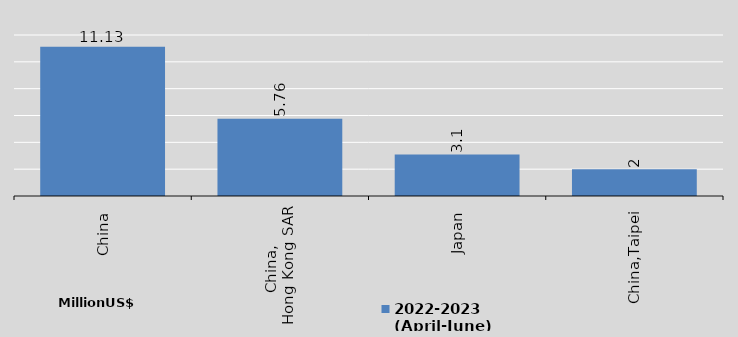
| Category | 2022-2023
(April-June) |
|---|---|
| China | 11.13 |
| China, 
Hong Kong SAR | 5.76 |
| Japan | 3.1 |
| China,Taipei | 2 |